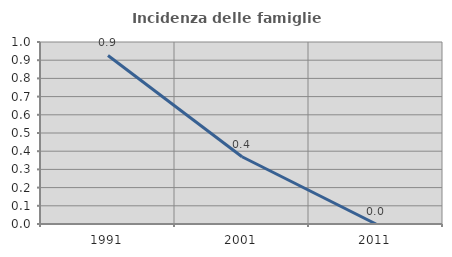
| Category | Incidenza delle famiglie numerose |
|---|---|
| 1991.0 | 0.926 |
| 2001.0 | 0.37 |
| 2011.0 | 0 |